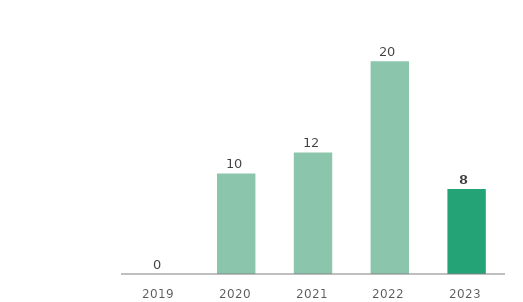
| Category | Assets in Kazakhstan |
|---|---|
| 2019.0 | 0 |
| 2020.0 | 9.6 |
| 2021.0 | 11.6 |
| 2022.0 | 20.3 |
| 2023.0 | 8.1 |